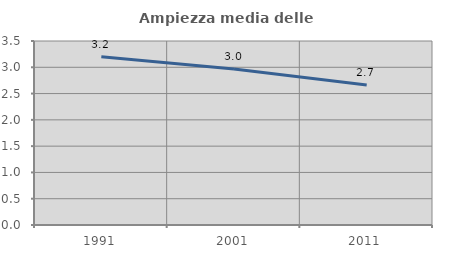
| Category | Ampiezza media delle famiglie |
|---|---|
| 1991.0 | 3.2 |
| 2001.0 | 2.966 |
| 2011.0 | 2.661 |